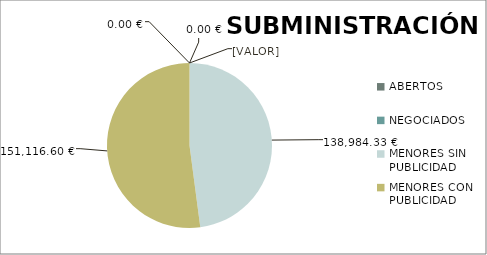
| Category | Series 0 |
|---|---|
| ABERTOS  | 0 |
| NEGOCIADOS  | 0 |
| MENORES SIN PUBLICIDAD | 138984.33 |
| MENORES CON PUBLICIDAD | 151116.6 |
| PROCEDEMENTO SIMPLIFICADO | 0 |